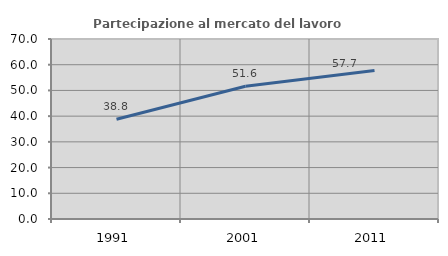
| Category | Partecipazione al mercato del lavoro  femminile |
|---|---|
| 1991.0 | 38.82 |
| 2001.0 | 51.643 |
| 2011.0 | 57.722 |